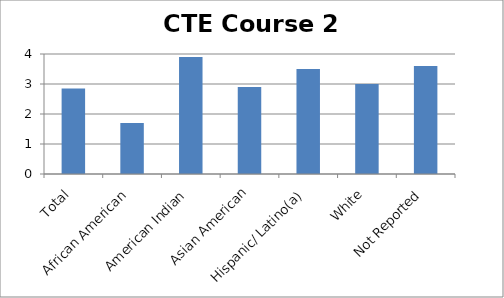
| Category | CTE Course 2 GPA |
|---|---|
| Total | 2.854 |
| African American | 1.7 |
| American Indian | 3.9 |
| Asian American | 2.9 |
| Hispanic/ Latino(a) | 3.5 |
| White | 3 |
| Not Reported | 3.6 |